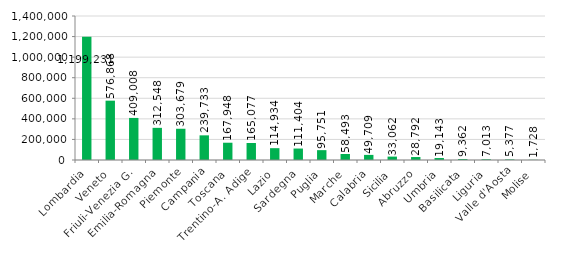
| Category | Series 0 |
|---|---|
| Lombardia | 1199231 |
| Veneto | 576868 |
| Friuli-Venezia G. | 409008 |
| Emilia-Romagna | 312548 |
| Piemonte | 303679 |
| Campania | 239733 |
| Toscana | 167948 |
| Trentino-A. Adige | 165077 |
| Lazio | 114934 |
| Sardegna | 111404 |
| Puglia | 95751 |
| Marche | 58493 |
| Calabria | 49709 |
| Sicilia | 33062 |
| Abruzzo | 28792 |
| Umbria | 19143 |
| Basilicata | 9362 |
| Liguria | 7013 |
| Valle d'Aosta | 5377 |
| Molise | 1728 |